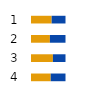
| Category | Series 0 | Series 1 |
|---|---|---|
| 0 | 59.818 | 40.182 |
| 1 | 54.734 | 45.266 |
| 2 | 63.478 | 36.522 |
| 3 | 57.143 | 42.857 |